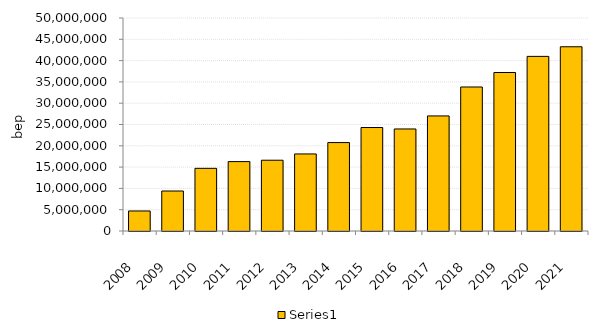
| Category | Series 0 |
|---|---|
| 2008.0 | 4699318 |
| 2009.0 | 9388434.848 |
| 2010.0 | 14710936.656 |
| 2011.0 | 16289514.176 |
| 2012.0 | 16612525.28 |
| 2013.0 | 18087035.824 |
| 2014.0 | 20759217.44 |
| 2015.0 | 24291336.687 |
| 2016.0 | 23954117.453 |
| 2017.0 | 27010829.977 |
| 2018.0 | 33805098.924 |
| 2019.0 | 37205414.009 |
| 2020.0 | 40989444.487 |
| 2021.0 | 43246028.043 |